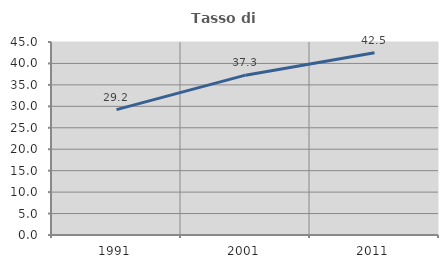
| Category | Tasso di occupazione   |
|---|---|
| 1991.0 | 29.227 |
| 2001.0 | 37.27 |
| 2011.0 | 42.476 |